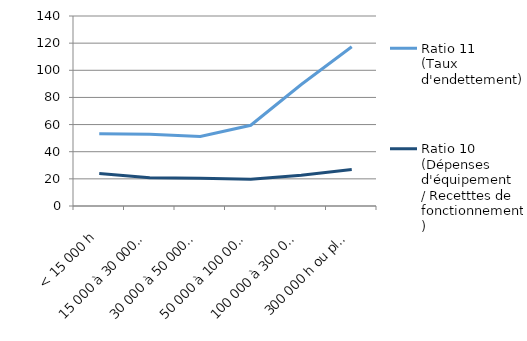
| Category | Ratio 11
(Taux d'endettement) | Ratio 10 
(Dépenses d'équipement
/ Recetttes de fonctionnement) |
|---|---|---|
| < 15 000 h | 53.307 | 24.001 |
| 15 000 à 30 000 h | 52.922 | 20.838 |
| 30 000 à 50 000 h | 51.153 | 20.408 |
| 50 000 à 100 000 h | 59.48 | 19.712 |
| 100 000 à 300 000 h | 89.537 | 22.68 |
| 300 000 h ou plus | 117.359 | 26.947 |